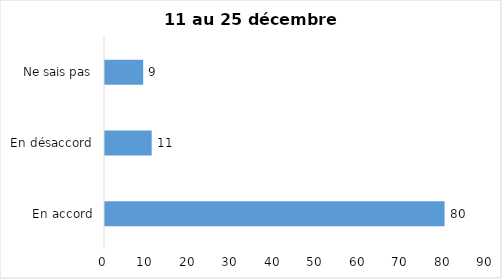
| Category | Series 0 |
|---|---|
| En accord | 80 |
| En désaccord | 11 |
| Ne sais pas | 9 |